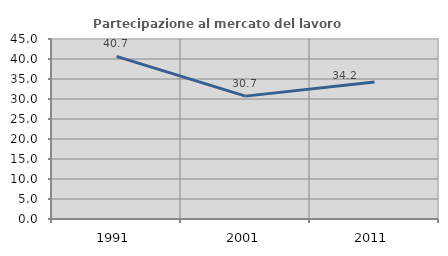
| Category | Partecipazione al mercato del lavoro  femminile |
|---|---|
| 1991.0 | 40.673 |
| 2001.0 | 30.717 |
| 2011.0 | 34.236 |